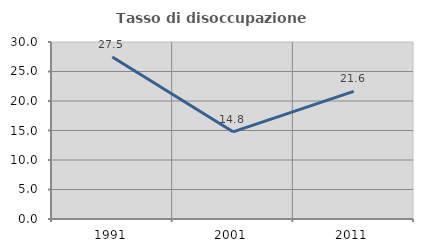
| Category | Tasso di disoccupazione giovanile  |
|---|---|
| 1991.0 | 27.451 |
| 2001.0 | 14.773 |
| 2011.0 | 21.622 |